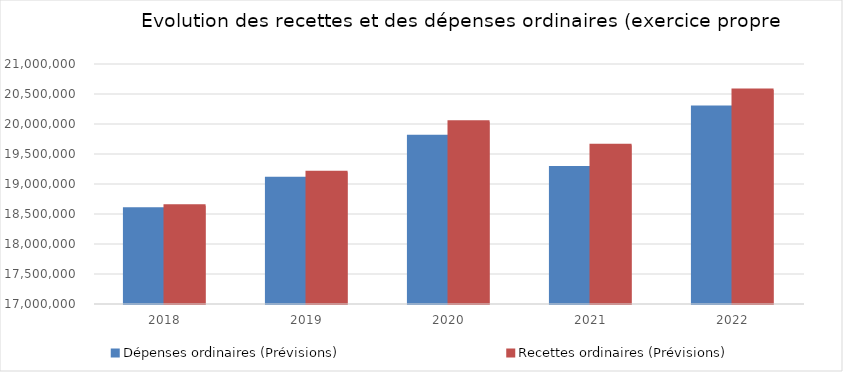
| Category | Dépenses ordinaires (Prévisions) | Recettes ordinaires (Prévisions) |
|---|---|---|
| 2018.0 | 18585915 | 18639197.87 |
| 2019.0 | 19094852.01 | 19194899.76 |
| 2020.0 | 19793787.59 | 20037851.11 |
| 2021.0 | 19276173.74 | 19647166.06 |
| 2022.0 | 20282483.44 | 20566740.87 |